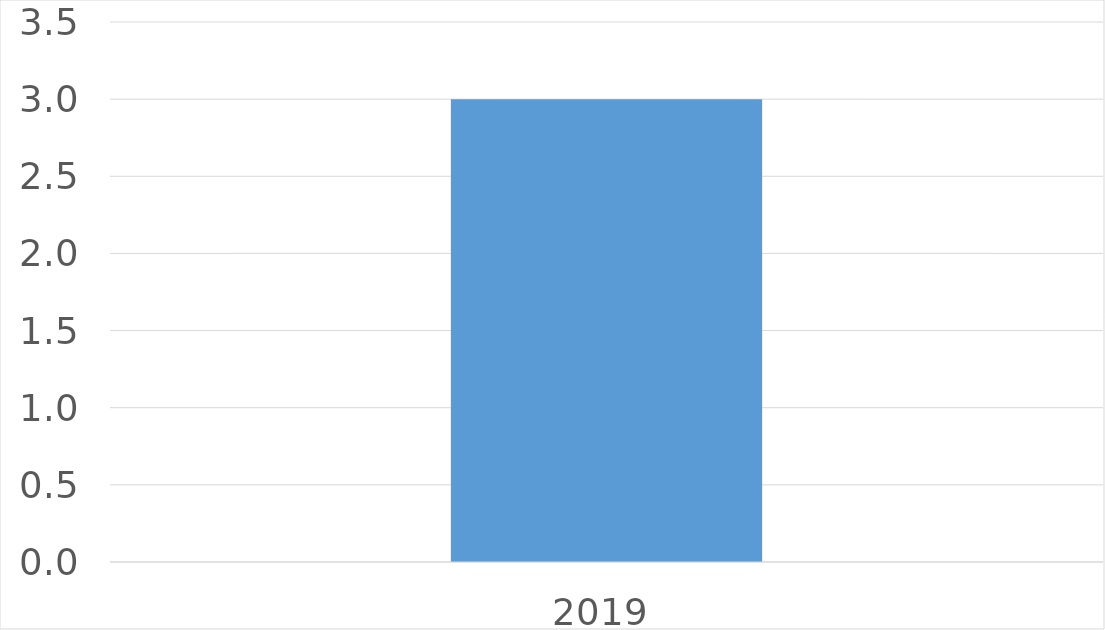
| Category | Series 0 |
|---|---|
| 2019 | 3 |